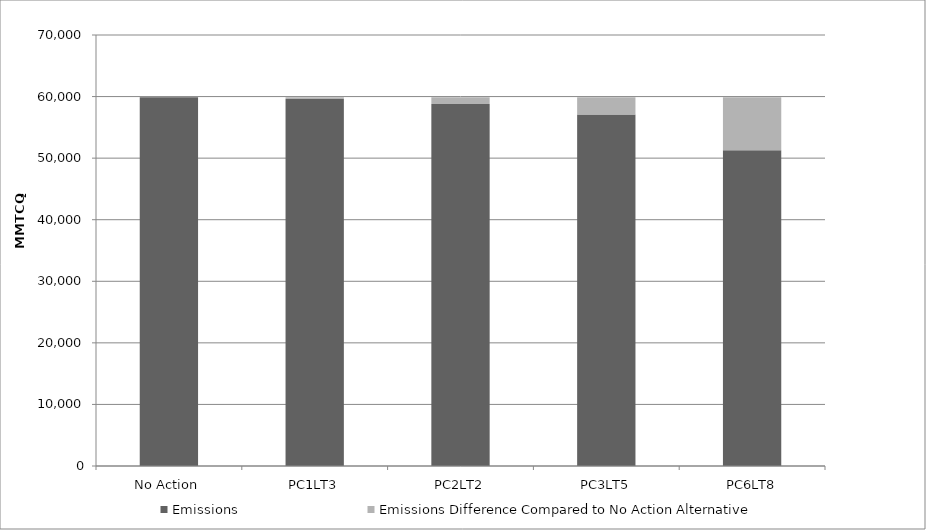
| Category | Emissions | Emissions Difference Compared to No Action Alternative |
|---|---|---|
| No Action | 59900 | 0 |
| PC1LT3 | 59600 | 300 |
| PC2LT2 | 58800 | 1100 |
| PC3LT5 | 57100 | 2800 |
| PC6LT8 | 51300 | 8600 |